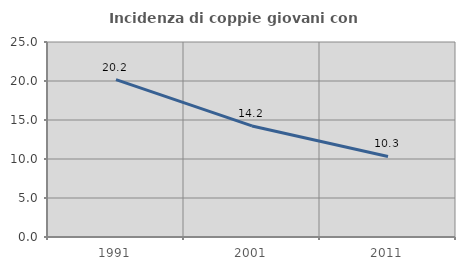
| Category | Incidenza di coppie giovani con figli |
|---|---|
| 1991.0 | 20.172 |
| 2001.0 | 14.242 |
| 2011.0 | 10.331 |